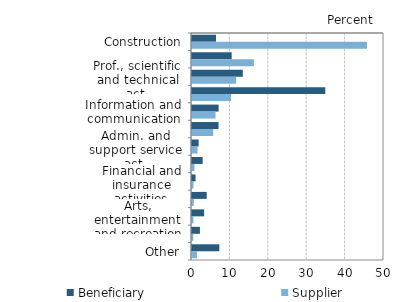
| Category | Beneficiary | Supplier |
|---|---|---|
| Construction | 6.257 | 45.573 |
| Trade; repair of motor vehicles | 10.335 | 16.126 |
| Prof., scientific and technical act. | 13.23 | 11.503 |
| Manufacturing | 34.714 | 10.173 |
| Information and communication | 6.934 | 6.129 |
| Real estate activities | 6.911 | 5.552 |
| Admin. and support service act. | 1.729 | 1.439 |
| Other services | 2.781 | 0.645 |
| Financial and insurance activities | 0.927 | 0.387 |
| Transportation and storage | 3.83 | 0.471 |
| Arts, entertainment and recreation | 3.16 | 0.385 |
| Water supply and mngt., sewerage | 2.067 | 0.322 |
| Other | 7.126 | 1.295 |